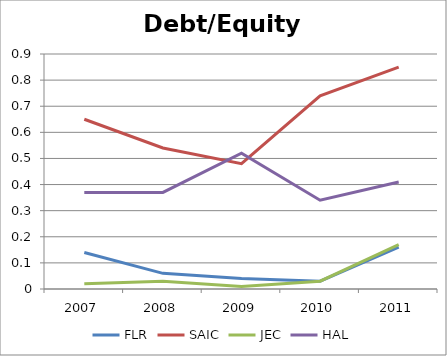
| Category | FLR | SAIC | JEC | HAL |
|---|---|---|---|---|
| 2007.0 | 0.14 | 0.65 | 0.02 | 0.37 |
| 2008.0 | 0.06 | 0.54 | 0.03 | 0.37 |
| 2009.0 | 0.04 | 0.48 | 0.01 | 0.52 |
| 2010.0 | 0.03 | 0.74 | 0.03 | 0.34 |
| 2011.0 | 0.16 | 0.85 | 0.17 | 0.41 |